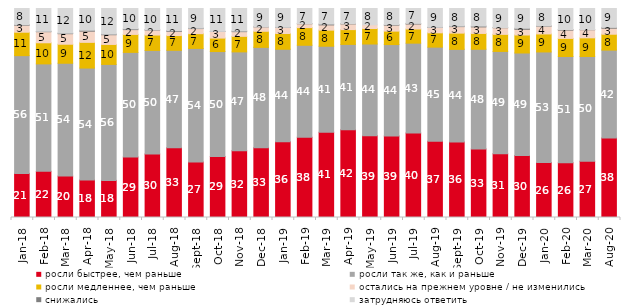
| Category | росли быстрее, чем раньше | росли так же, как и раньше | росли медленнее, чем раньше | остались на прежнем уровне / не изменились | снижались | затрудняюсь ответить |
|---|---|---|---|---|---|---|
| 2018-01-01 | 21.1 | 56.35 | 11.2 | 3.35 | 0.25 | 7.75 |
| 2018-02-01 | 22.1 | 51.4 | 10.1 | 5.3 | 0.2 | 10.9 |
| 2018-03-01 | 19.8 | 54 | 9.1 | 5.05 | 0.25 | 11.8 |
| 2018-04-01 | 17.95 | 53.55 | 12.3 | 5.35 | 0.45 | 10.4 |
| 2018-05-01 | 17.75 | 55.5 | 9.55 | 4.65 | 0.3 | 12.25 |
| 2018-06-01 | 28.9 | 50.1 | 8.6 | 2.3 | 0.35 | 9.75 |
| 2018-07-01 | 30.35 | 49.6 | 7.35 | 2.4 | 0.15 | 10.15 |
| 2018-08-01 | 33.35 | 46.65 | 7.05 | 2 | 0.35 | 10.6 |
| 2018-09-01 | 26.55 | 54.35 | 7.05 | 2.45 | 0.2 | 9.4 |
| 2018-10-01 | 29.2 | 50.2 | 6.45 | 3.15 | 0.05 | 10.95 |
| 2018-11-01 | 31.886 | 47.355 | 7.435 | 2.246 | 0.299 | 10.778 |
| 2018-12-01 | 33.4 | 48 | 7.7 | 2.1 | 0.05 | 8.75 |
| 2019-01-01 | 36.25 | 44.25 | 7.55 | 2.85 | 0.1 | 9 |
| 2019-02-01 | 38.35 | 44.05 | 8.45 | 1.85 | 0.05 | 7.25 |
| 2019-03-01 | 40.825 | 41.124 | 7.708 | 2.486 | 0.398 | 7.459 |
| 2019-04-01 | 42.03 | 40.792 | 7.079 | 2.723 | 0.149 | 7.228 |
| 2019-05-01 | 39.079 | 43.933 | 7.429 | 1.783 | 0 | 7.776 |
| 2019-06-01 | 39.052 | 43.691 | 6.434 | 2.843 | 0.249 | 7.731 |
| 2019-07-01 | 40.396 | 43.02 | 6.782 | 2.376 | 0.297 | 7.129 |
| 2019-08-01 | 36.513 | 45.005 | 6.843 | 2.547 | 0.1 | 8.991 |
| 2019-09-01 | 36.139 | 44.307 | 7.772 | 3.119 | 0.248 | 8.416 |
| 2019-10-01 | 32.822 | 47.673 | 7.574 | 3.119 | 0.396 | 8.416 |
| 2019-11-01 | 30.545 | 48.911 | 8.168 | 3.168 | 0.099 | 9.109 |
| 2019-12-01 | 29.653 | 49.059 | 8.614 | 2.723 | 0.495 | 9.455 |
| 2020-01-01 | 26.287 | 52.921 | 8.614 | 3.713 | 0.149 | 8.317 |
| 2020-02-01 | 26.139 | 50.891 | 8.663 | 3.96 | 0.297 | 10.05 |
| 2020-03-01 | 26.971 | 50.074 | 8.924 | 3.867 | 0.099 | 10.064 |
| 2020-08-01 | 38.083 | 42.006 | 7.597 | 2.88 | 0.397 | 9.037 |